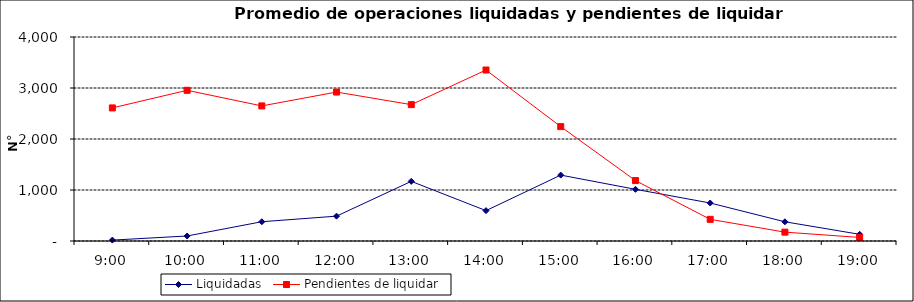
| Category | Liquidadas | Pendientes de liquidar |
|---|---|---|
| 0.375 | 17.524 | 2609.381 |
| 0.4166666666666667 | 98.143 | 2954.81 |
| 0.4583333333333333 | 378.048 | 2648.762 |
| 0.5 | 487.143 | 2920.571 |
| 0.5416666666666666 | 1169.714 | 2673.571 |
| 0.5833333333333334 | 595.429 | 3352.619 |
| 0.625 | 1292.238 | 2242.952 |
| 0.6666666666666666 | 1013.714 | 1185.048 |
| 0.7083333333333334 | 745.095 | 425.238 |
| 0.75 | 376.571 | 173.571 |
| 0.7916666666666666 | 131.048 | 69.905 |